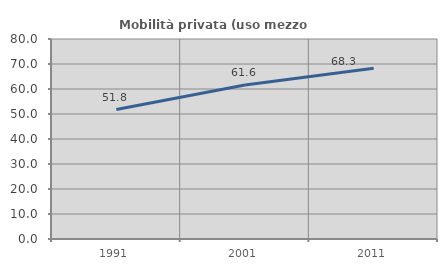
| Category | Mobilità privata (uso mezzo privato) |
|---|---|
| 1991.0 | 51.784 |
| 2001.0 | 61.592 |
| 2011.0 | 68.31 |